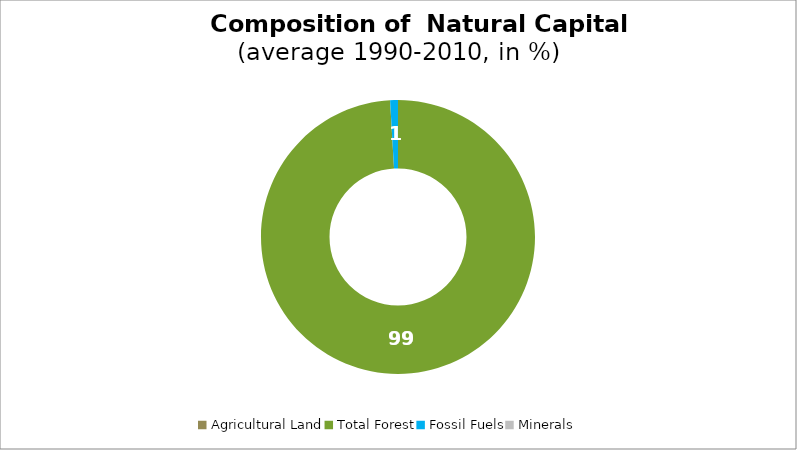
| Category | Series 0 |
|---|---|
| Agricultural Land | 0 |
| Total Forest | 99.078 |
| Fossil Fuels | 0.922 |
| Minerals | 0 |